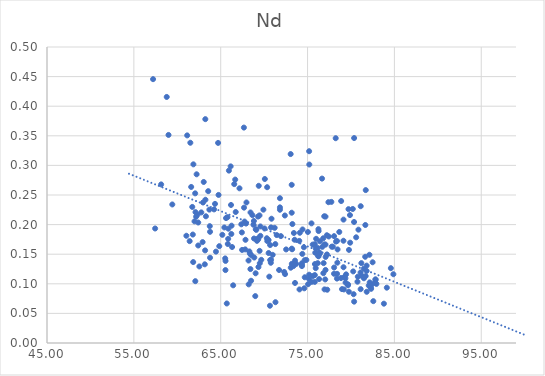
| Category | Series 0 |
|---|---|
| 58.9903942725759 | 0.351 |
| 70.79216450599262 | 0.195 |
| 63.773430342917024 | 0.144 |
| 70.8492364032757 | 0.21 |
| 58.78450238401475 | 0.416 |
| 73.33336373557566 | 0.133 |
| 68.83595235082795 | 0.177 |
| 66.43552570395144 | 0.097 |
| 68.20394464147004 | 0.139 |
| 73.55773834457152 | 0.139 |
| 73.06731270530967 | 0.127 |
| 73.25374019570579 | 0.201 |
| 61.14077195677048 | 0.351 |
| 74.39556633729688 | 0.151 |
| 62.91654017635521 | 0.17 |
| 63.773430342917 | 0.188 |
| 74.0455159923826 | 0.173 |
| 63.228749507720885 | 0.378 |
| 72.53220682422203 | 0.158 |
| 65.69837881122534 | 0.067 |
| 76.94375949552771 | 0.166 |
| 75.8374920028583 | 0.167 |
| 76.8514132543089 | 0.135 |
| 78.38527222316887 | 0.109 |
| 82.38163209749483 | 0.099 |
| 80.25689176980306 | 0.121 |
| 77.03519537670734 | 0.107 |
| 79.3772721717313 | 0.102 |
| 75.15071373358622 | 0.108 |
| 79.65372511119851 | 0.098 |
| 62.54124146511646 | 0.129 |
| 82.31984032252622 | 0.092 |
| 78.9668455207957 | 0.091 |
| 81.47901456446456 | 0.126 |
| 79.18127883447637 | 0.09 |
| 65.81711236187773 | 0.167 |
| 67.46288497860651 | 0.157 |
| 62.41235473863108 | 0.165 |
| 62.07618212174329 | 0.104 |
| 61.046824775571174 | 0.181 |
| 62.169133861550776 | 0.213 |
| 63.16860674816352 | 0.133 |
| 76.14846005253503 | 0.161 |
| 69.31477225236696 | 0.175 |
| 77.08162013228818 | 0.145 |
| 68.54292808548418 | 0.148 |
| 68.22328504708382 | 0.099 |
| 68.4961209731746 | 0.105 |
| 68.82043336917272 | 0.206 |
| 67.68620529232632 | 0.229 |
| 67.74735540781896 | 0.205 |
| 78.8693880219235 | 0.24 |
| 70.51712650332645 | 0.152 |
| 78.6544720139321 | 0.188 |
| 68.43228413231019 | 0.22 |
| 70.68893230215198 | 0.165 |
| 76.95622164533079 | 0.091 |
| 76.32907542762212 | 0.108 |
| 79.23222082701791 | 0.112 |
| 73.1870231154553 | 0.134 |
| 78.42992657335286 | 0.136 |
| 62.765941757633925 | 0.221 |
| 74.57743501942738 | 0.162 |
| 62.41235473863108 | 0.204 |
| 75.18146981610566 | 0.324 |
| 73.17618360782768 | 0.22 |
| 61.72743461867833 | 0.23 |
| 61.4261173377686 | 0.172 |
| 76.80523225379274 | 0.177 |
| 61.8323676483028 | 0.137 |
| 62.31957674310479 | 0.217 |
| 63.242762118973396 | 0.242 |
| 63.29678568728481 | 0.214 |
| 71.28819735599497 | 0.167 |
| 66.67114333833256 | 0.276 |
| 65.61466645165338 | 0.211 |
| 66.14654587432597 | 0.298 |
| 66.55817204964114 | 0.268 |
| 67.64825470318267 | 0.549 |
| 73.55641079159862 | 0.101 |
| 82.92674377109219 | 0.1 |
| 71.92904522958456 | 0.181 |
| 65.1888268030352 | 0.183 |
| 67.91567676437269 | 0.202 |
| 67.82353653011417 | 0.158 |
| 64.75012420362175 | 0.25 |
| 65.783272449002 | 0.213 |
| 64.34460590700326 | 0.235 |
| 54.441841448736696 | 1.226 |
| 68.65217704047832 | 0.216 |
| 62.09765586351388 | 0.221 |
| 66.72866666642122 | 0.221 |
| 70.59517427532883 | 0.112 |
| 65.85916334611562 | 0.176 |
| 67.67105714303173 | 0.364 |
| 63.69517928941117 | 0.225 |
| 82.76943565864808 | 0.103 |
| 70.34721732710504 | 0.263 |
| 69.02147100074518 | 0.118 |
| 76.27179410143144 | 0.189 |
| 75.9399577939121 | 0.126 |
| 68.35771829089505 | 0.151 |
| 57.449869284002766 | 0.193 |
| 71.30567462221333 | 0.069 |
| 76.42517484117153 | 0.172 |
| 65.55785625120195 | 0.139 |
| 69.38006736657805 | 0.266 |
| 82.81096955383904 | 0.107 |
| 81.10607095588252 | 0.119 |
| 82.4911308291691 | 0.136 |
| 78.06038721933706 | 0.128 |
| 82.57063257397459 | 0.071 |
| 75.60193364264843 | 0.113 |
| 82.84154046706858 | 0.107 |
| 75.83552116205178 | 0.115 |
| 79.75619503094555 | 0.087 |
| 84.88375779138208 | 0.116 |
| 84.59189053223194 | 0.126 |
| 81.48793973303967 | 0.109 |
| 80.74727141986341 | 0.104 |
| 76.81688488016604 | 0.118 |
| 74.67848787794246 | 0.111 |
| 74.623488208242 | 0.092 |
| 82.04511982234811 | 0.097 |
| 81.81355060452832 | 0.086 |
| 74.34425791088496 | 0.132 |
| 74.33803293462532 | 0.135 |
| 80.30355712330021 | 0.082 |
| 81.11260350394384 | 0.091 |
| 84.12696226989198 | 0.093 |
| 81.6912888800206 | 0.113 |
| 75.05798145063665 | 0.099 |
| 76.25028171146614 | 0.192 |
| 82.12333327711931 | 0.149 |
| 76.36641749976934 | 0.153 |
| 81.80067402257193 | 0.122 |
| 77.26567164071209 | 0.09 |
| 80.36265575896577 | 0.346 |
| 77.91350928176169 | 0.163 |
| 80.36265575896577 | 0.07 |
| 81.23855441308466 | 0.113 |
| 79.6638872638567 | 0.099 |
| 70.69288724416137 | 0.14 |
| 72.40943353136925 | 0.116 |
| 76.4118281749958 | 0.151 |
| 65.8847671603944 | 0.193 |
| 69.09602869821438 | 0.191 |
| 66.18637416836258 | 0.233 |
| 61.50434454005707 | 0.338 |
| 82.28433574180943 | 0.093 |
| 76.17384120084797 | 0.135 |
| 81.80312015525502 | 0.131 |
| 73.37264024239515 | 0.13 |
| 78.2416288735091 | 0.346 |
| 68.98034828239544 | 0.079 |
| 69.468656044469 | 0.216 |
| 78.0476302472342 | 0.117 |
| 64.23421953666221 | 0.226 |
| 61.98643474732764 | 0.205 |
| 62.06034844584499 | 0.253 |
| 61.855075420751355 | 0.302 |
| 62.226605892673554 | 0.285 |
| 77.73998667507449 | 0.238 |
| 71.45174395962765 | 0.182 |
| 67.43717410821796 | 0.187 |
| 74.6652539956237 | 0.14 |
| 70.36783396594736 | 0.172 |
| 70.08127544052755 | 0.277 |
| 79.71454613876257 | 0.226 |
| 74.42373432185045 | 0.192 |
| 80.20759080012529 | 0.226 |
| 63.56068254028562 | 0.256 |
| 75.18191990674312 | 0.115 |
| 65.5165072281159 | 0.143 |
| 67.16188580457386 | 0.261 |
| 75.84755541449908 | 0.133 |
| 69.17629118168563 | 0.173 |
| 75.20056010855674 | 0.301 |
| 59.42725592139267 | 0.234 |
| 64.8368271666208 | 0.164 |
| 79.35636813620228 | 0.109 |
| 73.68850954257981 | 0.134 |
| 75.8312394261979 | 0.103 |
| 78.84827652225374 | 0.11 |
| 70.77103036897734 | 0.136 |
| 64.69877299077156 | 0.338 |
| 81.70045450514256 | 0.258 |
| 74.07343901217816 | 0.09 |
| 81.19497660288394 | 0.135 |
| 62.963250623691046 | 0.237 |
| 74.86061720394908 | 0.14 |
| 82.15298431885134 | 0.102 |
| 69.03790939159455 | 0.192 |
| 83.79001389309906 | 0.066 |
| 68.77423104778421 | 0.2 |
| 69.56650021895895 | 0.181 |
| 76.91972115480766 | 0.214 |
| 70.30943394295204 | 0.177 |
| 69.91489938483726 | 0.225 |
| 69.67244335977365 | 0.14 |
| 77.06744925272586 | 0.166 |
| 69.5692009818156 | 0.197 |
| 77.06744925272586 | 0.214 |
| 71.8208002460284 | 0.245 |
| 71.8208002460284 | 0.225 |
| 71.8208002460284 | 0.229 |
| 72.3093934980735 | 0.12 |
| 76.26650506175854 | 0.146 |
| 69.47942118131164 | 0.156 |
| 69.29955054519955 | 0.214 |
| 75.88709581980659 | 0.153 |
| 70.66899033787581 | 0.063 |
| 77.22349556274781 | 0.182 |
| 63.742429576812945 | 0.197 |
| 73.22776454127003 | 0.158 |
| 75.45331213047581 | 0.202 |
| 81.1198769753397 | 0.231 |
| 0.0 | 0.222 |
| 75.93995779391209 | 0.16 |
| 80.85912664149853 | 0.191 |
| 75.0400268751973 | 0.188 |
| 77.78068178385367 | 0.163 |
| 76.21705983545367 | 0.147 |
| 100.0 | 0.17 |
| 80.35476053810137 | 0.204 |
| 63.20469848623034 | 0.156 |
| 77.07117381665539 | 0.123 |
| 79.43822219048316 | 0.116 |
| 79.14094442369516 | 0.128 |
| 77.23175382903187 | 0.15 |
| 80.78584173316798 | 0.112 |
| 78.27716107123928 | 0.171 |
| 73.5182531268539 | 0.174 |
| 81.65453438016557 | 0.199 |
| 73.42566075722695 | 0.186 |
| 80.59585806893806 | 0.179 |
| 78.45593070586408 | 0.158 |
| 81.63569271144235 | 0.146 |
| 77.4360951600226 | 0.18 |
| 79.88306732789728 | 0.216 |
| 71.213862911756 | 0.195 |
| 79.7676586385669 | 0.157 |
| 64.45268053194074 | 0.154 |
| 75.5897443260721 | 0.166 |
| 67.96611766716524 | 0.237 |
| 70.51230431181493 | 0.174 |
| 76.70074104545454 | 0.162 |
| 74.35393912069058 | 0.13 |
| 78.05283051444512 | 0.18 |
| 71.72200498808702 | 0.123 |
| 79.90454423722991 | 0.169 |
| 68.86698888544618 | 0.144 |
| 73.17278021369528 | 0.159 |
| 78.38662810155215 | 0.172 |
| 79.13954142988622 | 0.208 |
| 66.2247739810231 | 0.184 |
| 66.31053011827474 | 0.162 |
| 73.05511569939164 | 0.319 |
| 65.54841879587768 | 0.123 |
| 67.37442463936013 | 0.2 |
| 70.05171467950619 | 0.193 |
| 79.13388863301196 | 0.173 |
| 65.41990710293125 | 0.195 |
| 61.788008517873685 | 0.183 |
| 70.9833312641638 | 0.149 |
| 61.602049936017586 | 0.264 |
| 66.25066544458383 | 0.198 |
| 75.45179302646285 | 0.103 |
| 68.42152459089603 | 0.125 |
| 69.29826288628647 | 0.177 |
| 67.85520209111964 | 0.174 |
| 76.66756172334257 | 0.278 |
| 73.17534137665088 | 0.267 |
| 72.38552251563843 | 0.215 |
| 69.34517042876418 | 0.128 |
| 74.10976050119145 | 0.186 |
| 68.30124442837443 | 0.155 |
| 78.40066072822287 | 0.117 |
| 69.49997635758928 | 0.135 |
| 63.044896727446556 | 0.272 |
| 65.94309293394265 | 0.291 |
| 75.9877869465892 | 0.176 |
| 70.8000543891683 | 0.141 |
| 77.40255155296218 | 0.238 |
| 57.21189650920507 | 0.446 |
| 58.14394375002036 | 0.268 |